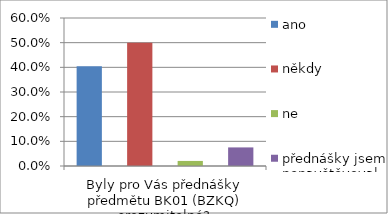
| Category | ano | někdy | ne | přednášky jsem nenavštěvoval |
|---|---|---|---|---|
| Byly pro Vás přednášky předmětu BK01 (BZKQ) srozumitelné? | 0.404 | 0.5 | 0.021 | 0.075 |